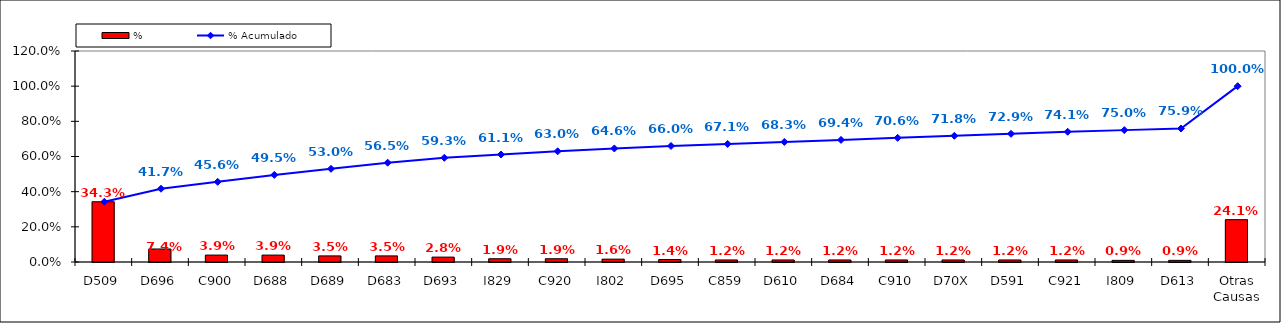
| Category | % |
|---|---|
| D509 | 0.343 |
| D696 | 0.074 |
| C900 | 0.039 |
| D688 | 0.039 |
| D689 | 0.035 |
| D683 | 0.035 |
| D693 | 0.028 |
| I829 | 0.019 |
| C920 | 0.019 |
| I802 | 0.016 |
| D695 | 0.014 |
| C859 | 0.012 |
| D610 | 0.012 |
| D684 | 0.012 |
| C910 | 0.012 |
| D70X | 0.012 |
| D591 | 0.012 |
| C921 | 0.012 |
| I809 | 0.009 |
| D613 | 0.009 |
| Otras Causas | 0.241 |